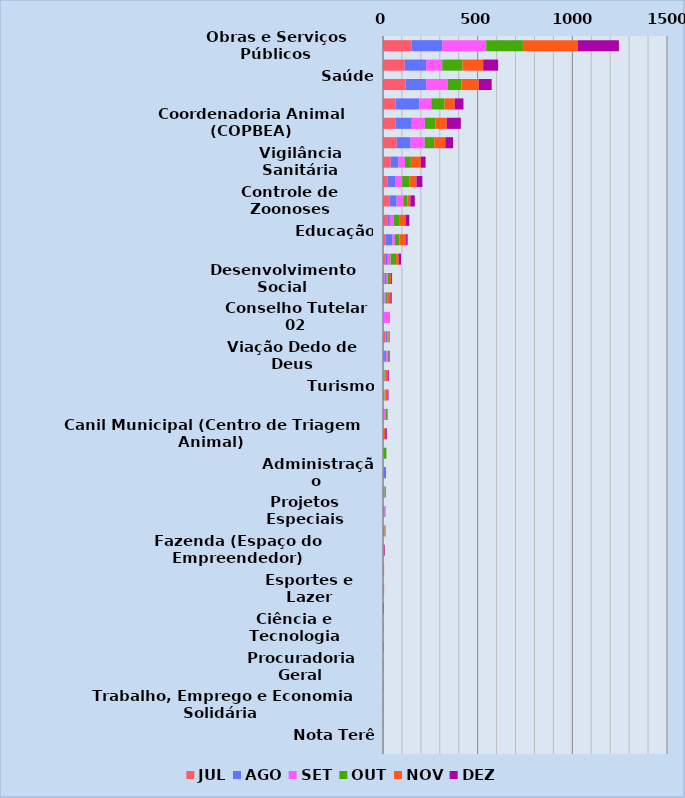
| Category | JUL | AGO | SET | OUT | NOV | DEZ |
|---|---|---|---|---|---|---|
| Obras e Serviços Públicos | 150 | 163 | 232 | 194 | 289 | 218 |
| Meio Ambiente | 115 | 113 | 85 | 107 | 109 | 79 |
| Saúde | 119 | 110 | 113 | 72 | 92 | 68 |
| Segurança Pública | 67 | 125 | 63 | 70 | 54 | 46 |
| Coordenadoria Animal (COPBEA) | 68 | 84 | 69 | 56 | 60 | 74 |
| Planejamento | 73 | 73 | 74 | 51 | 58 | 41 |
| Vigilância Sanitária | 41 | 41 | 34 | 31 | 53 | 25 |
| Fiscalização Fazendária (Posturas e Tributos) | 24 | 40 | 37 | 38 | 38 | 31 |
| Controle de Zoonoses | 35 | 37 | 35 | 22 | 16 | 23 |
| Defesa Civil | 23 | 13 | 22 | 27 | 34 | 20 |
| Educação | 14 | 36 | 13 | 24 | 35 | 8 |
| Inova Ambiental (Coleta de Lixo Domiciliar) | 12 | 13 | 15 | 29 | 14 | 12 |
| Desenvolvimento Social | 9 | 10 | 5 | 13 | 6 | 5 |
| Agricultura | 5 | 3 | 5 | 12 | 14 | 7 |
| Conselho Tutelar 02 | 0 | 1 | 31 | 2 | 1 | 1 |
| Fazenda (ITBI, Dívida Ativa, Cálculo e Certidões, IPTU) | 13 | 8 | 4 | 4 | 5 | 2 |
| Viação Dedo de Deus | 6 | 11 | 9 | 4 | 0 | 5 |
| Conselho Municipal de Defesa dos Direitos da Pessoa Idosa | 3 | 1 | 4 | 6 | 13 | 4 |
| Turismo | 7 | 0 | 2 | 5 | 10 | 5 |
| Conselho Tutelar 01 | 0 | 4 | 10 | 8 | 2 | 1 |
| Canil Municipal (Centro de Triagem Animal) | 0 | 0 | 0 | 4 | 8 | 8 |
| Conselho Municipal dos Direitos da Criança e do Adolescente  (CMDCA) | 0 | 3 | 1 | 14 | 0 | 0 |
| Administração | 3 | 9 | 0 | 1 | 0 | 3 |
| Ouvidoria Geral | 3 | 4 | 1 | 5 | 2 | 1 |
| Projetos Especiais | 8 | 2 | 3 | 1 | 0 | 0 |
| Novo PROMAJ | 1 | 4 | 2 | 2 | 2 | 2 |
| Fazenda (Espaço do Empreendedor) | 0 | 2 | 1 | 0 | 4 | 3 |
| Cultura | 1 | 1 | 1 | 2 | 1 | 0 |
| Esportes e Lazer | 2 | 0 | 1 | 1 | 2 | 0 |
| Direitos da Mulher | 0 | 0 | 0 | 0 | 1 | 3 |
| Ciência e Tecnologia | 2 | 1 | 0 | 0 | 0 | 0 |
| Comunicação | 0 | 0 | 0 | 0 | 0 | 2 |
| Procuradoria Geral | 0 | 2 | 0 | 0 | 0 | 0 |
| TEREPREV | 0 | 0 | 0 | 2 | 0 | 0 |
| Trabalho, Emprego e Economia Solidária | 0 | 1 | 1 | 0 | 0 | 0 |
| Governo | 0 | 0 | 0 | 1 | 0 | 0 |
| Nota Terê | 0 | 0 | 1 | 0 | 0 | 0 |